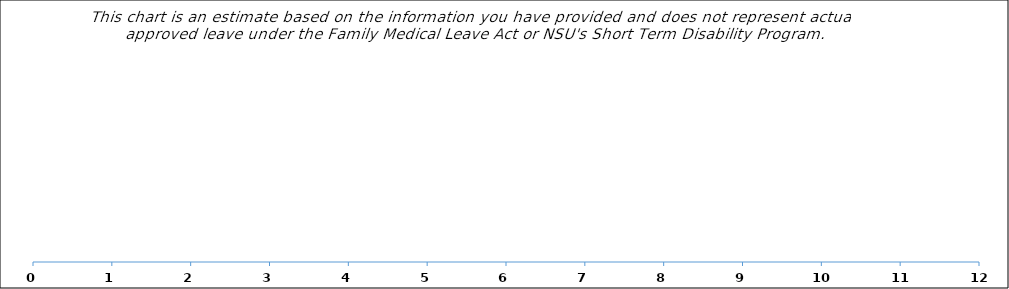
| Category | Weeks of leave paid using PTO | Weeks of leave paid using STD (60%) | Weeks of unpaid FMLA |
|---|---|---|---|
| 0 | 0 | 0 | 0 |